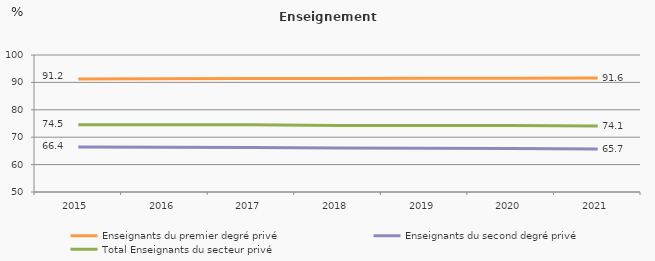
| Category | Enseignants du premier degré privé | Enseignants du second degré privé | Total Enseignants du secteur privé |
|---|---|---|---|
| 2015.0 | 91.2 | 66.4 | 74.5 |
| 2016.0 | 91.3 | 66.3 | 74.5 |
| 2017.0 | 91.4 | 66.2 | 74.5 |
| 2018.0 | 91.4 | 66.1 | 74.3 |
| 2019.0 | 91.5 | 66 | 74.3 |
| 2020.0 | 91.5 | 65.9 | 74.3 |
| 2021.0 | 91.6 | 65.7 | 74.1 |